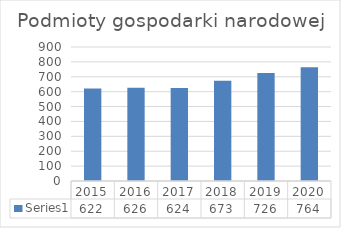
| Category | Series 0 |
|---|---|
| 2015.0 | 622 |
| 2016.0 | 626 |
| 2017.0 | 624 |
| 2018.0 | 673 |
| 2019.0 | 726 |
| 2020.0 | 764 |